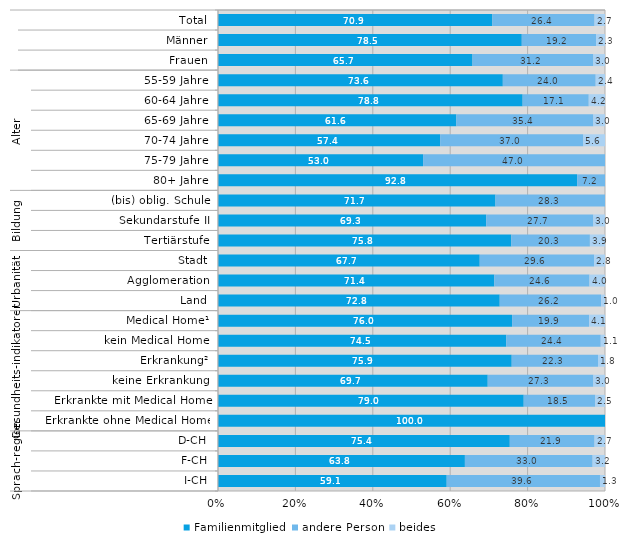
| Category | Familienmitglied | andere Person | beides |
|---|---|---|---|
| 0 | 70.9 | 26.4 | 2.7 |
| 1 | 78.5 | 19.2 | 2.3 |
| 2 | 65.7 | 31.2 | 3 |
| 3 | 73.6 | 24 | 2.4 |
| 4 | 78.8 | 17.1 | 4.2 |
| 5 | 61.6 | 35.4 | 3 |
| 6 | 57.4 | 37 | 5.6 |
| 7 | 53 | 47 | 0 |
| 8 | 92.8 | 7.2 | 0 |
| 9 | 71.7 | 28.3 | 0 |
| 10 | 69.3 | 27.7 | 3 |
| 11 | 75.8 | 20.3 | 3.9 |
| 12 | 67.7 | 29.6 | 2.8 |
| 13 | 71.4 | 24.6 | 4 |
| 14 | 72.8 | 26.2 | 1 |
| 15 | 76 | 19.9 | 4.1 |
| 16 | 74.5 | 24.4 | 1.1 |
| 17 | 75.9 | 22.3 | 1.8 |
| 18 | 69.7 | 27.3 | 3 |
| 19 | 79 | 18.5 | 2.5 |
| 20 | 100 | 0 | 0 |
| 21 | 75.4 | 21.9 | 2.7 |
| 22 | 63.8 | 33 | 3.2 |
| 23 | 59.1 | 39.6 | 1.3 |